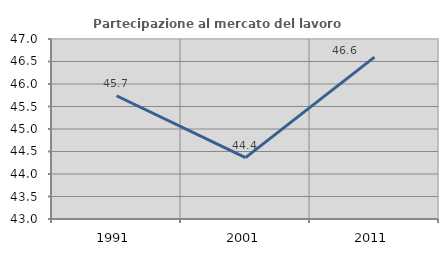
| Category | Partecipazione al mercato del lavoro  femminile |
|---|---|
| 1991.0 | 45.739 |
| 2001.0 | 44.363 |
| 2011.0 | 46.596 |